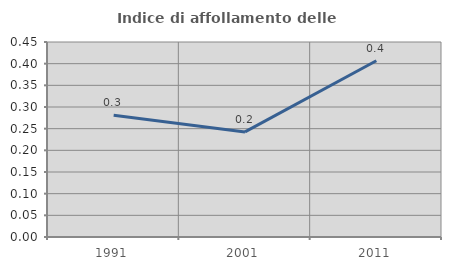
| Category | Indice di affollamento delle abitazioni  |
|---|---|
| 1991.0 | 0.281 |
| 2001.0 | 0.243 |
| 2011.0 | 0.407 |